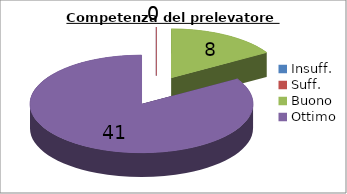
| Category | Competenza del prelevatore |
|---|---|
| Insuff. | 0 |
| Suff. | 0 |
| Buono | 8 |
| Ottimo | 41 |